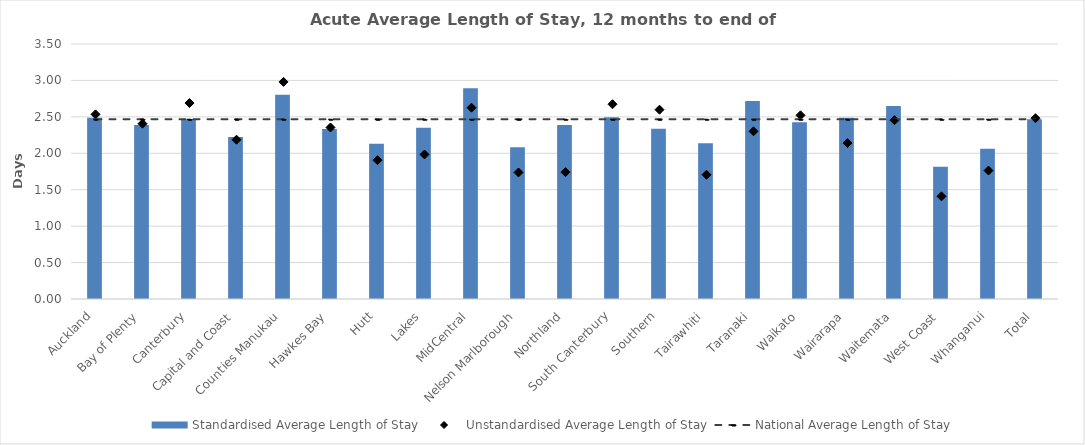
| Category | Standardised Average Length of Stay |
|---|---|
| Auckland | 2.489 |
| Bay of Plenty | 2.388 |
| Canterbury | 2.469 |
| Capital and Coast | 2.222 |
| Counties Manukau | 2.802 |
| Hawkes Bay | 2.334 |
| Hutt | 2.131 |
| Lakes | 2.349 |
| MidCentral | 2.891 |
| Nelson Marlborough | 2.083 |
| Northland | 2.39 |
| South Canterbury | 2.493 |
| Southern | 2.338 |
| Tairawhiti | 2.138 |
| Taranaki | 2.717 |
| Waikato | 2.427 |
| Wairarapa | 2.487 |
| Waitemata | 2.648 |
| West Coast | 1.814 |
| Whanganui | 2.063 |
| Total | 2.467 |